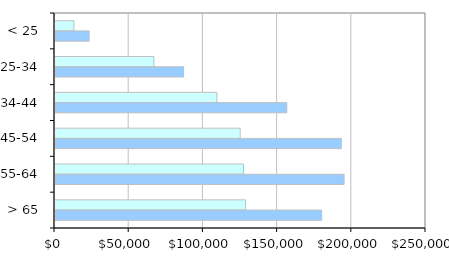
| Category | 2001 | 2010 |
|---|---|---|
| < 25 | 12743 | 23005 |
| 25-34 | 66630 | 86667 |
| 34-44 | 109140 | 156195 |
| 45-54 | 124791 | 192946 |
| 55-64 | 127027 | 194815 |
| > 65 | 128429 | 179701 |